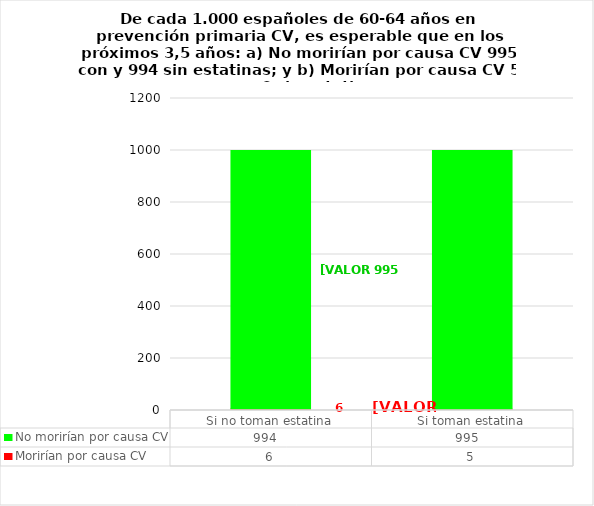
| Category | Morirían por causa CV | No morirían por causa CV |
|---|---|---|
| Si no toman estatina | 6 | 994 |
| Si toman estatina | 5 | 995 |